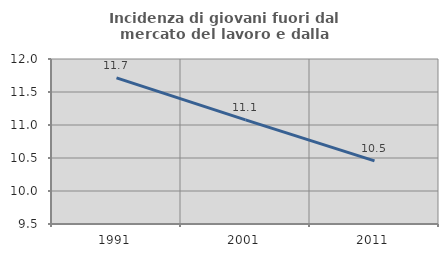
| Category | Incidenza di giovani fuori dal mercato del lavoro e dalla formazione  |
|---|---|
| 1991.0 | 11.714 |
| 2001.0 | 11.077 |
| 2011.0 | 10.457 |